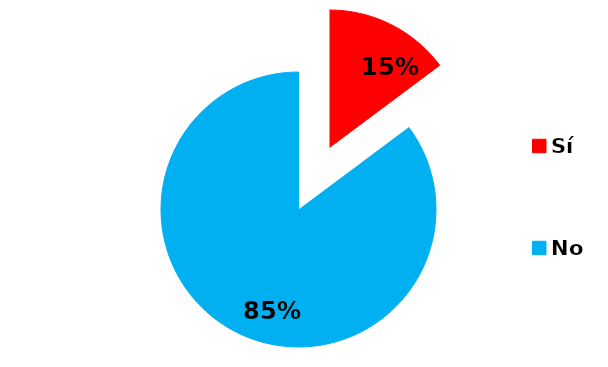
| Category | Series 0 |
|---|---|
| Sí | 37 |
| No | 213 |